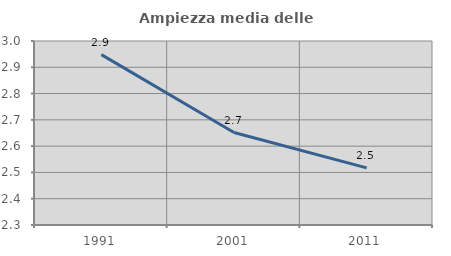
| Category | Ampiezza media delle famiglie |
|---|---|
| 1991.0 | 2.948 |
| 2001.0 | 2.652 |
| 2011.0 | 2.517 |